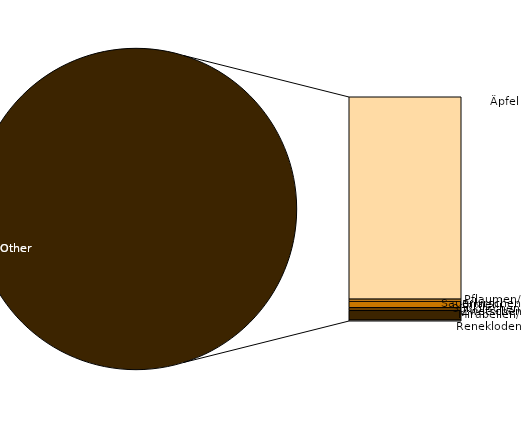
| Category | Series 0 |
|---|---|
| Äpfel | 26599 |
| Birnen | 293 |
| Süßkirschen | 817 |
| Sauerkirschen | 391 |
| Pflaumen/Zwetschen | 1252 |
| Mirabellen/Renekloden | 124 |